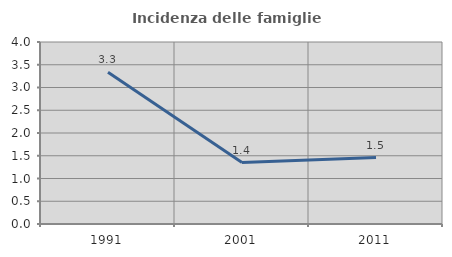
| Category | Incidenza delle famiglie numerose |
|---|---|
| 1991.0 | 3.333 |
| 2001.0 | 1.351 |
| 2011.0 | 1.46 |